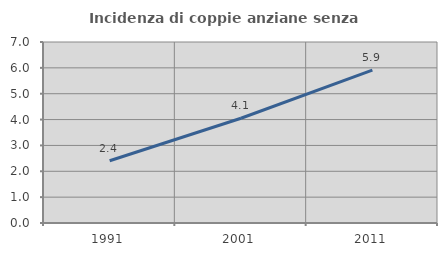
| Category | Incidenza di coppie anziane senza figli  |
|---|---|
| 1991.0 | 2.409 |
| 2001.0 | 4.051 |
| 2011.0 | 5.911 |